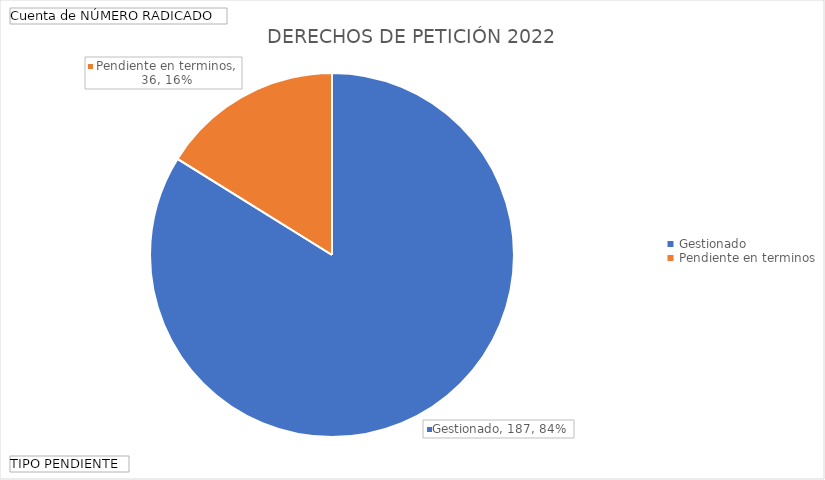
| Category | Total |
|---|---|
| Gestionado | 187 |
| Pendiente en terminos | 36 |